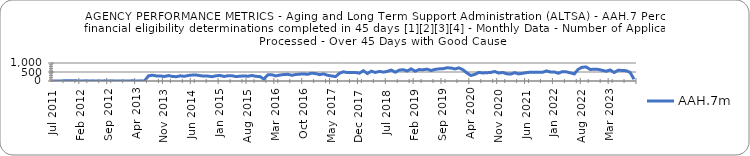
| Category | AAH.7m |
|---|---|
| 2011-07-01 | 6 |
| 2011-08-01 | 5 |
| 2011-09-01 | 5 |
| 2011-10-01 | 8 |
| 2011-11-01 | 7 |
| 2011-12-01 | 11 |
| 2012-01-01 | 7 |
| 2012-02-01 | 5 |
| 2012-03-01 | 7 |
| 2012-04-01 | 5 |
| 2012-05-01 | 7 |
| 2012-06-01 | 5 |
| 2012-07-01 | 6 |
| 2012-08-01 | 7 |
| 2012-09-01 | 4 |
| 2012-10-01 | 7 |
| 2012-11-01 | 4 |
| 2012-12-01 | 6 |
| 2013-01-01 | 4 |
| 2013-02-01 | 5 |
| 2013-03-01 | 8 |
| 2013-04-01 | 3 |
| 2013-05-01 | 7 |
| 2013-06-01 | 6 |
| 2013-07-01 | 285 |
| 2013-08-01 | 323 |
| 2013-09-01 | 280 |
| 2013-10-01 | 281 |
| 2013-11-01 | 249 |
| 2013-12-01 | 303 |
| 2014-01-01 | 254 |
| 2014-02-01 | 239 |
| 2014-03-01 | 288 |
| 2014-04-01 | 258 |
| 2014-05-01 | 308 |
| 2014-06-01 | 329 |
| 2014-07-01 | 332 |
| 2014-08-01 | 298 |
| 2014-09-01 | 271 |
| 2014-10-01 | 272 |
| 2014-11-01 | 239 |
| 2014-12-01 | 292 |
| 2015-01-01 | 308 |
| 2015-02-01 | 251 |
| 2015-03-01 | 294 |
| 2015-04-01 | 291 |
| 2015-05-01 | 244 |
| 2015-06-01 | 268 |
| 2015-07-01 | 280 |
| 2015-08-01 | 267 |
| 2015-09-01 | 305 |
| 2015-10-01 | 260 |
| 2015-11-01 | 246 |
| 2015-12-01 | 108 |
| 2016-01-01 | 346 |
| 2016-02-01 | 346 |
| 2016-03-01 | 282 |
| 2016-04-01 | 330 |
| 2016-05-01 | 359 |
| 2016-06-01 | 371 |
| 2016-07-01 | 318 |
| 2016-08-01 | 361 |
| 2016-09-01 | 380 |
| 2016-10-01 | 393 |
| 2016-11-01 | 370 |
| 2016-12-01 | 436 |
| 2017-01-01 | 410 |
| 2017-02-01 | 352 |
| 2017-03-01 | 395 |
| 2017-04-01 | 317 |
| 2017-05-01 | 280 |
| 2017-06-01 | 243 |
| 2017-07-01 | 429 |
| 2017-08-01 | 512 |
| 2017-09-01 | 466 |
| 2017-10-01 | 471 |
| 2017-11-01 | 471 |
| 2017-12-01 | 434 |
| 2018-01-01 | 571 |
| 2018-02-01 | 415 |
| 2018-03-01 | 545 |
| 2018-04-01 | 473 |
| 2018-05-01 | 533 |
| 2018-06-01 | 494 |
| 2018-07-01 | 533 |
| 2018-08-01 | 610 |
| 2018-09-01 | 489 |
| 2018-10-01 | 604 |
| 2018-11-01 | 630 |
| 2018-12-01 | 555 |
| 2019-01-01 | 673 |
| 2019-02-01 | 545 |
| 2019-03-01 | 634 |
| 2019-04-01 | 626 |
| 2019-05-01 | 659 |
| 2019-06-01 | 581 |
| 2019-07-01 | 646 |
| 2019-08-01 | 673 |
| 2019-09-01 | 683 |
| 2019-10-01 | 734 |
| 2019-11-01 | 723 |
| 2019-12-01 | 670 |
| 2020-01-01 | 730 |
| 2020-02-01 | 625 |
| 2020-03-01 | 449 |
| 2020-04-01 | 307 |
| 2020-05-01 | 369 |
| 2020-06-01 | 478 |
| 2020-07-01 | 447 |
| 2020-08-01 | 460 |
| 2020-09-01 | 477 |
| 2020-10-01 | 527 |
| 2020-11-01 | 444 |
| 2020-12-01 | 473 |
| 2021-01-01 | 402 |
| 2021-02-01 | 382 |
| 2021-03-01 | 463 |
| 2021-04-01 | 395 |
| 2021-05-01 | 426 |
| 2021-06-01 | 465 |
| 2021-07-01 | 491 |
| 2021-08-01 | 482 |
| 2021-09-01 | 487 |
| 2021-10-01 | 481 |
| 2021-11-01 | 561 |
| 2021-12-01 | 499 |
| 2022-01-01 | 496 |
| 2022-02-01 | 432 |
| 2022-03-01 | 521 |
| 2022-04-01 | 508 |
| 2022-05-01 | 452 |
| 2022-06-01 | 394 |
| 2022-07-01 | 654 |
| 2022-08-01 | 766 |
| 2022-09-01 | 775 |
| 2022-10-01 | 640 |
| 2022-11-01 | 657 |
| 2022-12-01 | 645 |
| 2023-01-01 | 595 |
| 2023-02-01 | 543 |
| 2023-03-01 | 615 |
| 2023-04-01 | 470 |
| 2023-05-01 | 598 |
| 2023-06-01 | 587 |
| 2023-07-01 | 572 |
| 2023-08-01 | 482 |
| 2023-09-01 | 98 |